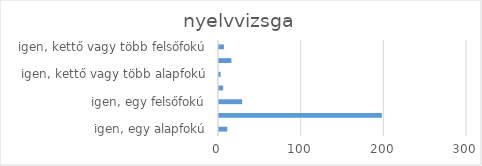
| Category | Series 0 |
|---|---|
| igen, egy alapfokú | 10 |
| igen, egy középfokú | 197 |
| igen, egy felsőfokú | 28 |
| igen, egy alap, egy közép | 5 |
| igen, kettő vagy több alapfokú | 2 |
| igen, kettő vagy több középfokú | 15 |
| igen, kettő vagy több felsőfokú | 6 |